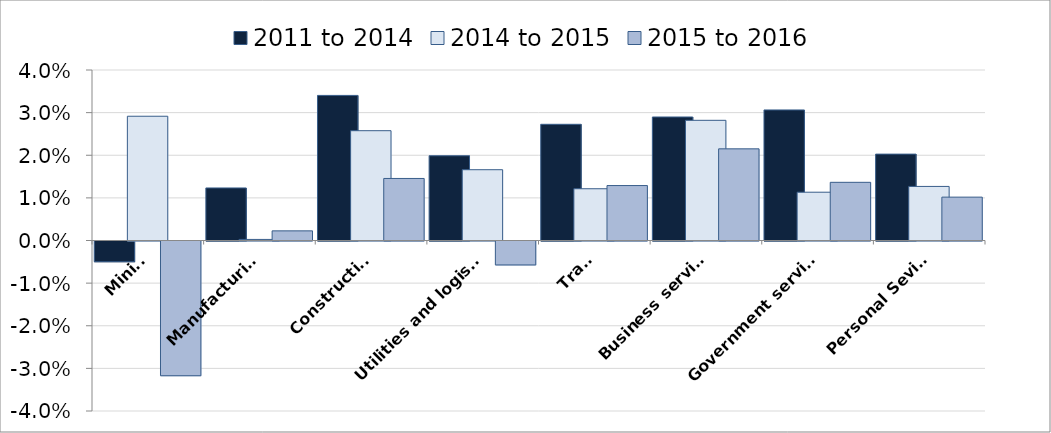
| Category | 2011 to 2014 | 2014 to 2015 | 2015 to 2016 |
|---|---|---|---|
| Mining | -0.005 | 0.029 | -0.032 |
| Manufacturing | 0.012 | 0 | 0.002 |
| Construction | 0.034 | 0.026 | 0.015 |
| Utilities and logistics | 0.02 | 0.017 | -0.006 |
| Trade | 0.027 | 0.012 | 0.013 |
| Business services | 0.029 | 0.028 | 0.022 |
| Government services | 0.031 | 0.011 | 0.014 |
| Personal Sevices | 0.02 | 0.013 | 0.01 |